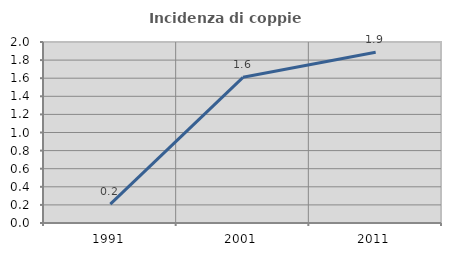
| Category | Incidenza di coppie miste |
|---|---|
| 1991.0 | 0.209 |
| 2001.0 | 1.61 |
| 2011.0 | 1.887 |